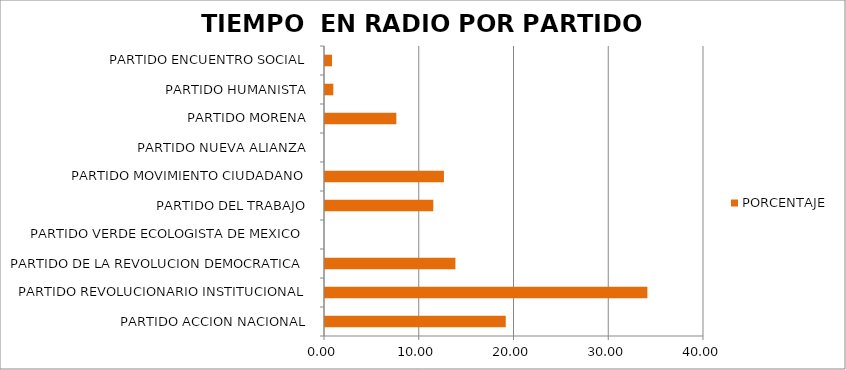
| Category | PORCENTAJE |
|---|---|
| PARTIDO ACCION NACIONAL | 19.078 |
| PARTIDO REVOLUCIONARIO INSTITUCIONAL | 34.026 |
| PARTIDO DE LA REVOLUCION DEMOCRATICA | 13.764 |
| PARTIDO VERDE ECOLOGISTA DE MEXICO | 0 |
| PARTIDO DEL TRABAJO | 11.428 |
| PARTIDO MOVIMIENTO CIUDADANO | 12.554 |
| PARTIDO NUEVA ALIANZA | 0 |
| PARTIDO MORENA | 7.529 |
| PARTIDO HUMANISTA | 0.879 |
| PARTIDO ENCUENTRO SOCIAL | 0.742 |